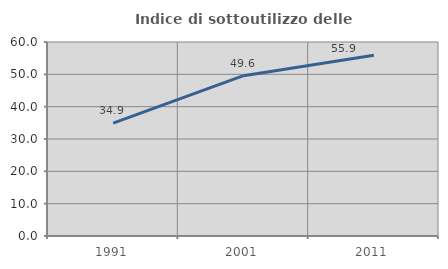
| Category | Indice di sottoutilizzo delle abitazioni  |
|---|---|
| 1991.0 | 34.895 |
| 2001.0 | 49.574 |
| 2011.0 | 55.872 |